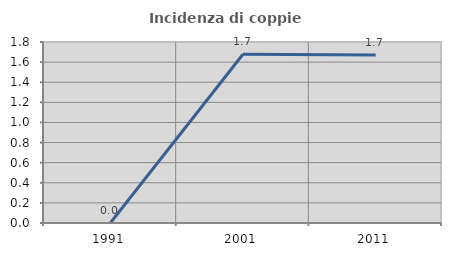
| Category | Incidenza di coppie miste |
|---|---|
| 1991.0 | 0 |
| 2001.0 | 1.678 |
| 2011.0 | 1.671 |